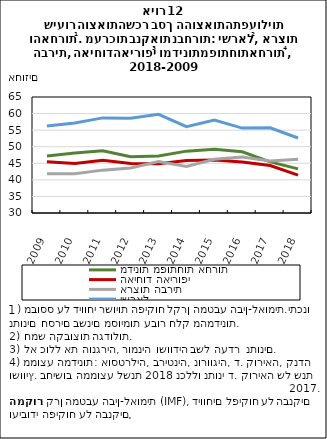
| Category | מדינות מפותחות אחרות | האיחוד האירופי | ארצות הברית | ישראל |
|---|---|---|---|---|
| 2009.0 | 47.173 | 45.46 | 41.87 | 56.239 |
| 2010.0 | 48.104 | 44.956 | 41.861 | 57.17 |
| 2011.0 | 48.752 | 45.925 | 42.933 | 58.7 |
| 2012.0 | 46.945 | 44.93 | 43.562 | 58.59 |
| 2013.0 | 47.175 | 44.867 | 45.52 | 59.78 |
| 2014.0 | 48.665 | 45.854 | 44.016 | 56.06 |
| 2015.0 | 49.224 | 46.018 | 46.237 | 58.06 |
| 2016.0 | 48.486 | 45.4 | 46.859 | 55.62 |
| 2017.0 | 45.437 | 44.331 | 45.661 | 55.73 |
| 2018.0 | 43.321 | 41.447 | 46.191 | 52.63 |